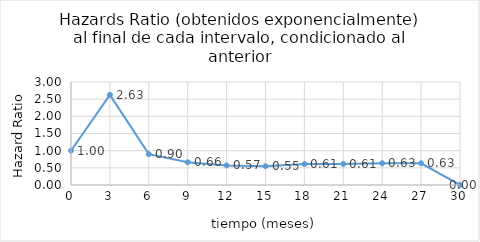
| Category | Series 0 |
|---|---|
| 0.0 | 1 |
| 3.0 | 2.626 |
| 6.0 | 0.898 |
| 9.0 | 0.663 |
| 12.0 | 0.57 |
| 15.0 | 0.546 |
| 18.0 | 0.611 |
| 21.0 | 0.613 |
| 24.0 | 0.633 |
| 27.0 | 0.633 |
| 30.0 | 0 |